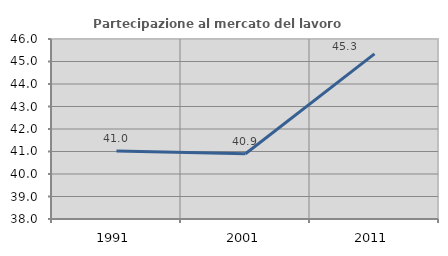
| Category | Partecipazione al mercato del lavoro  femminile |
|---|---|
| 1991.0 | 41.02 |
| 2001.0 | 40.9 |
| 2011.0 | 45.341 |